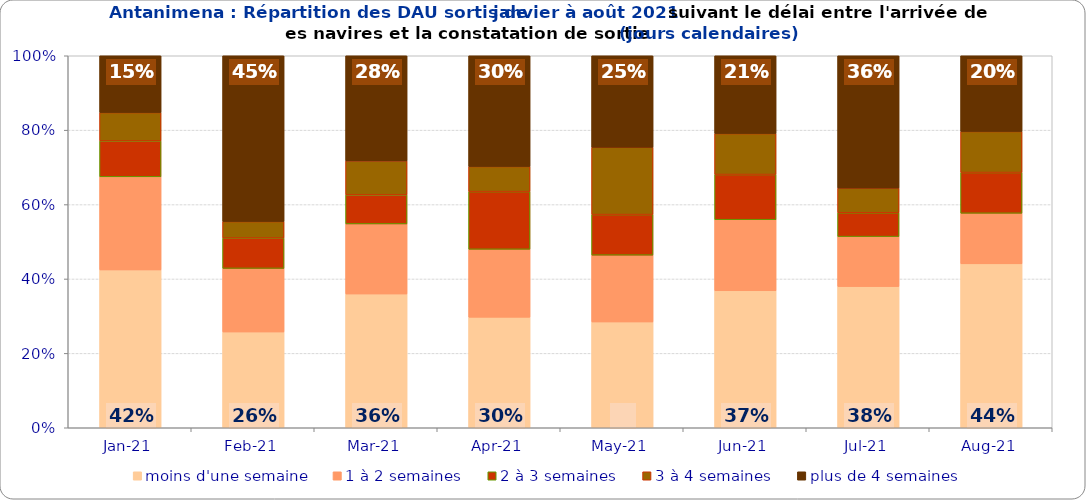
| Category | moins d'une semaine | 1 à 2 semaines | 2 à 3 semaines | 3 à 4 semaines | plus de 4 semaines |
|---|---|---|---|---|---|
| 2021-01-01 | 0.424 | 0.25 | 0.096 | 0.076 | 0.153 |
| 2021-02-01 | 0.257 | 0.171 | 0.081 | 0.044 | 0.446 |
| 2021-03-01 | 0.36 | 0.188 | 0.078 | 0.091 | 0.283 |
| 2021-04-01 | 0.297 | 0.183 | 0.155 | 0.068 | 0.298 |
| 2021-05-01 | 0.284 | 0.18 | 0.109 | 0.181 | 0.246 |
| 2021-06-01 | 0.368 | 0.191 | 0.122 | 0.11 | 0.209 |
| 2021-07-01 | 0.379 | 0.134 | 0.064 | 0.067 | 0.356 |
| 2021-08-01 | 0.441 | 0.136 | 0.11 | 0.11 | 0.204 |